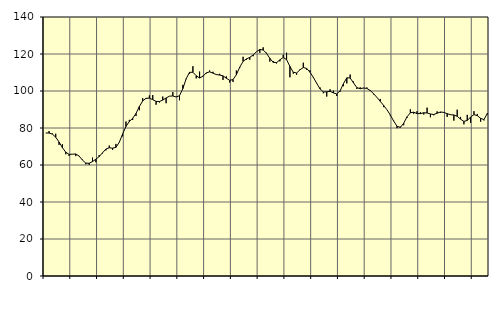
| Category | Piggar | Series 1 |
|---|---|---|
| nan | 77.3 | 77.29 |
| 87.0 | 78.3 | 77.29 |
| 87.0 | 77 | 76.69 |
| 87.0 | 76.9 | 75.03 |
| nan | 70.9 | 72.43 |
| 88.0 | 71.2 | 69.39 |
| 88.0 | 65.8 | 66.92 |
| 88.0 | 64.9 | 65.76 |
| nan | 65.9 | 65.83 |
| 89.0 | 64.8 | 65.97 |
| 89.0 | 64.9 | 64.82 |
| 89.0 | 62.9 | 62.62 |
| nan | 60.4 | 61.03 |
| 90.0 | 60.1 | 60.93 |
| 90.0 | 64 | 61.85 |
| 90.0 | 61.5 | 63.13 |
| nan | 65.4 | 64.56 |
| 91.0 | 66.3 | 66.62 |
| 91.0 | 67.9 | 68.63 |
| 91.0 | 70.5 | 69.3 |
| nan | 68.2 | 69.1 |
| 92.0 | 71.4 | 69.54 |
| 92.0 | 72.4 | 72.28 |
| 92.0 | 75.5 | 76.78 |
| nan | 83.5 | 80.84 |
| 93.0 | 84.4 | 83.51 |
| 93.0 | 84.3 | 85.25 |
| 93.0 | 86.5 | 87.85 |
| nan | 89.6 | 91.61 |
| 94.0 | 96.1 | 94.64 |
| 94.0 | 95.7 | 96.05 |
| 94.0 | 97.6 | 96.12 |
| nan | 97.8 | 95.32 |
| 95.0 | 92.6 | 94.39 |
| 95.0 | 93.8 | 94.31 |
| 95.0 | 97 | 95.1 |
| nan | 93.4 | 96.25 |
| 96.0 | 97.2 | 97.21 |
| 96.0 | 99.4 | 97.32 |
| 96.0 | 96.9 | 96.74 |
| nan | 95 | 97.46 |
| 97.0 | 103.3 | 101.3 |
| 97.0 | 106.4 | 106.66 |
| 97.0 | 109.2 | 110.11 |
| nan | 113.4 | 110.11 |
| 98.0 | 106.8 | 108.25 |
| 98.0 | 110.5 | 107.03 |
| 98.0 | 108.2 | 107.92 |
| nan | 109.5 | 109.81 |
| 99.0 | 111.1 | 110.33 |
| 99.0 | 110.4 | 109.66 |
| 99.0 | 108.7 | 108.89 |
| nan | 109.3 | 108.61 |
| 0.0 | 106 | 108.18 |
| 0.0 | 107.9 | 106.9 |
| 0.0 | 104.6 | 105.77 |
| nan | 104.9 | 106.18 |
| 1.0 | 111.1 | 108.81 |
| 1.0 | 112.4 | 112.87 |
| 1.0 | 118.5 | 116 |
| nan | 116.9 | 117.35 |
| 2.0 | 116.9 | 118.18 |
| 2.0 | 118.8 | 119.46 |
| 2.0 | 121.2 | 121.23 |
| nan | 120.6 | 122.47 |
| 3.0 | 123.6 | 122.15 |
| 3.0 | 120.7 | 120.38 |
| 3.0 | 115.9 | 117.66 |
| nan | 116.2 | 115.48 |
| 4.0 | 114.9 | 115.33 |
| 4.0 | 116 | 116.84 |
| 4.0 | 119.6 | 118.15 |
| nan | 120.7 | 116.96 |
| 5.0 | 107.4 | 113.31 |
| 5.0 | 109.4 | 110.12 |
| 5.0 | 108.8 | 109.76 |
| nan | 111.7 | 111.43 |
| 6.0 | 115.3 | 112.68 |
| 6.0 | 111.5 | 112.2 |
| 6.0 | 111.2 | 110.15 |
| nan | 107.1 | 107.37 |
| 7.0 | 104 | 104.16 |
| 7.0 | 101.9 | 101.14 |
| 7.0 | 98.8 | 99.49 |
| nan | 97 | 99.55 |
| 8.0 | 100.9 | 99.82 |
| 8.0 | 100.2 | 98.97 |
| 8.0 | 97.3 | 98.4 |
| nan | 99.6 | 100.09 |
| 9.0 | 102.6 | 103.99 |
| 9.0 | 104.1 | 107.12 |
| 9.0 | 108.9 | 107.05 |
| nan | 105.1 | 104.4 |
| 10.0 | 101.1 | 101.84 |
| 10.0 | 102 | 101.22 |
| 10.0 | 101.5 | 101.65 |
| nan | 101.9 | 101.37 |
| 11.0 | 100.5 | 100.27 |
| 11.0 | 98.2 | 98.58 |
| 11.0 | 96.5 | 96.55 |
| nan | 95.7 | 94.39 |
| 12.0 | 91.3 | 92.22 |
| 12.0 | 89.9 | 89.89 |
| 12.0 | 86.7 | 87.04 |
| nan | 84 | 83.77 |
| 13.0 | 79.9 | 80.95 |
| 13.0 | 80.7 | 80.31 |
| 13.0 | 81.5 | 82.58 |
| nan | 85.5 | 86.04 |
| 14.0 | 90.1 | 88.26 |
| 14.0 | 87.7 | 88.54 |
| 14.0 | 89.1 | 87.8 |
| nan | 88.5 | 87.77 |
| 15.0 | 87.3 | 88.26 |
| 15.0 | 91 | 88.12 |
| 15.0 | 85.8 | 87.58 |
| nan | 86.9 | 87.3 |
| 16.0 | 89 | 87.99 |
| 16.0 | 88.1 | 88.66 |
| 16.0 | 88.6 | 88.43 |
| nan | 86 | 87.73 |
| 17.0 | 87.3 | 87.18 |
| 17.0 | 84 | 87.04 |
| 17.0 | 89.9 | 86.33 |
| nan | 86 | 84.78 |
| 18.0 | 82 | 83.57 |
| 18.0 | 87.1 | 84.06 |
| 18.0 | 82.8 | 85.95 |
| nan | 89.1 | 87.22 |
| 19.0 | 87.6 | 86.69 |
| 19.0 | 83.4 | 85.22 |
| 19.0 | 84.1 | 84.54 |
| nan | 87.4 | 87.92 |